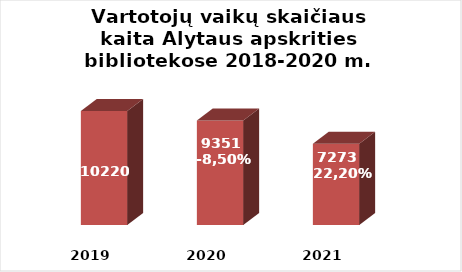
| Category | Series 0 |
|---|---|
| 2019.0 | 10220 |
| 2020.0 | 9351 |
| 2021.0 | 7273 |